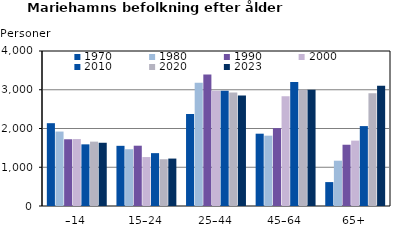
| Category | 1970 | 1980 | 1990 | 2000 | 2010 | 2020 | 2023 |
|---|---|---|---|---|---|---|---|
| –14 | 2137 | 1921 | 1722 | 1728 | 1591 | 1661 | 1632 |
| 15–24 | 1553 | 1465 | 1556 | 1263 | 1364 | 1207 | 1224 |
| 25–44 | 2373 | 3183 | 3395 | 2977 | 2975 | 2926 | 2852 |
| 45–64 | 1866 | 1815 | 2009 | 2833 | 3198 | 3001 | 2998 |
| 65+ | 617 | 1169 | 1581 | 1687 | 2062 | 2910 | 3106 |